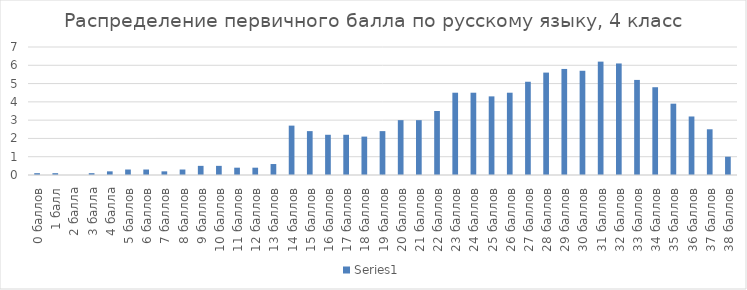
| Category | Series 0 |
|---|---|
| 0 баллов | 0.1 |
| 1 балл | 0.1 |
| 2 балла | 0 |
| 3 балла | 0.1 |
| 4 балла | 0.2 |
| 5 баллов | 0.3 |
| 6 баллов | 0.3 |
| 7 баллов | 0.2 |
| 8 баллов | 0.3 |
| 9 баллов | 0.5 |
| 10 баллов | 0.5 |
| 11 баллов | 0.4 |
| 12 баллов | 0.4 |
| 13 баллов | 0.6 |
| 14 баллов | 2.7 |
| 15 баллов | 2.4 |
| 16 баллов | 2.2 |
| 17 баллов | 2.2 |
| 18 баллов | 2.1 |
| 19 баллов | 2.4 |
| 20 баллов | 3 |
| 21 баллов | 3 |
| 22 баллов | 3.5 |
| 23 баллов | 4.5 |
| 24 баллов | 4.5 |
| 25 баллов | 4.3 |
| 26 баллов | 4.5 |
| 27 баллов | 5.1 |
| 28 баллов | 5.6 |
| 29 баллов | 5.8 |
| 30 баллов | 5.7 |
| 31 баллов | 6.2 |
| 32 баллов | 6.1 |
| 33 баллов | 5.2 |
| 34 баллов | 4.8 |
| 35 баллов | 3.9 |
| 36 баллов | 3.2 |
| 37 баллов | 2.5 |
| 38 баллов | 1 |